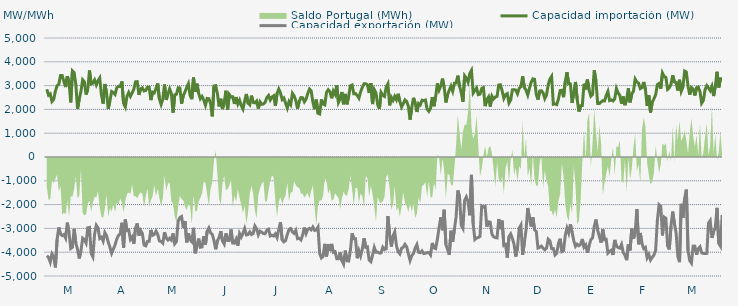
| Category | Capacidad importación (MW) | Capacidad exportación (MW) |
|---|---|---|
| 0 | 2845.5 | -4151.25 |
| 1900-01-01 | 2597.292 | -4215 |
| 1900-01-02 | 2650.375 | -4415.625 |
| 1900-01-03 | 2331.042 | -4066.875 |
| 1900-01-04 | 2415.625 | -4185 |
| 1900-01-05 | 2763.875 | -4638.75 |
| 1900-01-06 | 2996.042 | -3465 |
| 1900-01-07 | 3054.375 | -2960.625 |
| 1900-01-08 | 3421.875 | -3238.875 |
| 1900-01-09 | 3422.25 | -3301.458 |
| 1900-01-10 | 3168.75 | -3257.708 |
| 1900-01-11 | 2940.75 | -3407.5 |
| 1900-01-12 | 3391.875 | -2758.75 |
| 1900-01-13 | 3159.375 | -3175.208 |
| 1900-01-14 | 2294.792 | -3843.75 |
| 1900-01-15 | 3620.625 | -3793.125 |
| 1900-01-16 | 3550.208 | -3016.875 |
| 1900-01-17 | 3036.458 | -3616.875 |
| 1900-01-18 | 2023.333 | -3886.25 |
| 1900-01-19 | 2440.208 | -4263.75 |
| 1900-01-20 | 2764.167 | -3943.125 |
| 1900-01-21 | 3245.625 | -3410.667 |
| 1900-01-22 | 3161.25 | -3470.625 |
| 1900-01-23 | 2621.458 | -3614.625 |
| 1900-01-24 | 2861.25 | -2975.958 |
| 1900-01-25 | 3635.217 | -2962.391 |
| 1900-01-26 | 3071.083 | -4052.75 |
| 1900-01-27 | 3103.625 | -4196.25 |
| 1900-01-28 | 3238.125 | -3235.75 |
| 1900-01-29 | 3031.875 | -2868.708 |
| 1900-01-30 | 3202.5 | -2981.292 |
| 1900-01-31 | 3320.625 | -3422.292 |
| 1900-02-01 | 2615.625 | -3370.417 |
| 1900-02-02 | 2244.375 | -3535.625 |
| 1900-02-03 | 3067.5 | -3176.25 |
| 1900-02-04 | 2692.458 | -3306.875 |
| 1900-02-05 | 2025 | -3576.042 |
| 1900-02-06 | 2373.833 | -3795 |
| 1900-02-07 | 2750.458 | -4045 |
| 1900-02-08 | 2704.167 | -3868.417 |
| 1900-02-09 | 2628.75 | -3691.667 |
| 1900-02-10 | 2910 | -3448.125 |
| 1900-02-11 | 2971.875 | -3293.375 |
| 1900-02-12 | 2958.5 | -3229.167 |
| 1900-02-13 | 3174.375 | -2764.583 |
| 1900-02-14 | 2253.75 | -3813.75 |
| 1900-02-15 | 2100 | -2628.667 |
| 1900-02-16 | 2557.5 | -3088.333 |
| 1900-02-17 | 2713.125 | -3062.25 |
| 1900-02-18 | 2546.875 | -3463.625 |
| 1900-02-19 | 2686.458 | -3359.458 |
| 1900-02-20 | 2850 | -3646.042 |
| 1900-02-21 | 3159.375 | -2992.292 |
| 1900-02-22 | 3166.875 | -2793.125 |
| 1900-02-23 | 2613.75 | -3298.833 |
| 1900-02-24 | 2857.5 | -3089.625 |
| 1900-02-25 | 2903.875 | -3210.125 |
| 1900-02-26 | 2772 | -3696.792 |
| 1900-02-27 | 2797.5 | -3731.25 |
| 1900-02-28 | 2930.625 | -3545.625 |
| 1900-02-28 | 2932.5 | -3541.875 |
| 1900-03-01 | 2390.625 | -3064.167 |
| 1900-03-02 | 2726.25 | -3293.333 |
| 1900-03-03 | 2694.375 | -3252.708 |
| 1900-03-04 | 2878.125 | -3111.875 |
| 1900-03-05 | 3088.125 | -3247.5 |
| 1900-03-06 | 2435.625 | -3528.958 |
| 1900-03-07 | 2206.875 | -3547.708 |
| 1900-03-08 | 2435.625 | -3618.75 |
| 1900-03-09 | 3046.875 | -3157.917 |
| 1900-03-10 | 2400 | -3406.875 |
| 1900-03-11 | 2640 | -3488.125 |
| 1900-03-12 | 2866.875 | -3413.542 |
| 1900-03-13 | 2675.625 | -3486.458 |
| 1900-03-14 | 1861.25 | -3211.667 |
| 1900-03-15 | 2611.875 | -3644.375 |
| 1900-03-16 | 2638.125 | -3547.083 |
| 1900-03-17 | 2906.25 | -2688.333 |
| 1900-03-18 | 2904.375 | -2549.583 |
| 1900-03-19 | 2240.625 | -2502.083 |
| 1900-03-20 | 2576.25 | -2981.667 |
| 1900-03-21 | 2732.25 | -2689.375 |
| 1900-03-22 | 2919.375 | -3586.875 |
| 1900-03-23 | 3078.75 | -3206.25 |
| 1900-03-24 | 2587.5 | -3481.875 |
| 1900-03-25 | 2430 | -3560.625 |
| 1900-03-26 | 3341.25 | -2977.542 |
| 1900-03-27 | 2733.75 | -4046.25 |
| 1900-03-28 | 3080.625 | -3725.417 |
| 1900-03-29 | 2681.25 | -3429.375 |
| 1900-03-30 | 2448.75 | -3793.125 |
| 1900-03-31 | 2544.125 | -3778.125 |
| 1900-04-01 | 2394.958 | -3328.125 |
| 1900-04-02 | 2175 | -3678.75 |
| 1900-04-03 | 2461.167 | -3117.375 |
| 1900-04-04 | 2448.75 | -2981.542 |
| 1900-04-05 | 2255.042 | -3185.833 |
| 1900-04-06 | 1708.042 | -3250.208 |
| 1900-04-07 | 2981.25 | -3508.125 |
| 1900-04-08 | 2998.125 | -3877.5 |
| 1900-04-09 | 2664.375 | -3519.375 |
| 1900-04-10 | 2124.375 | -3382.5 |
| 1900-04-11 | 2446.875 | -3115.792 |
| 1900-04-12 | 2015.417 | -3534.375 |
| 1900-04-13 | 2289.375 | -3658.125 |
| 1900-04-14 | 2784.375 | -3211.083 |
| 1900-04-15 | 1993.125 | -3504.792 |
| 1900-04-16 | 2624.875 | -3506.458 |
| 1900-04-17 | 2523.75 | -3042.583 |
| 1900-04-18 | 2531.25 | -3613.125 |
| 1900-04-19 | 2229.583 | -3620.625 |
| 1900-04-20 | 2515.875 | -3455.625 |
| 1900-04-21 | 2227.5 | -3723.75 |
| 1900-04-22 | 2388.375 | -3217.458 |
| 1900-04-23 | 2157.875 | -3361.542 |
| 1900-04-24 | 2014.583 | -3202.708 |
| 1900-04-25 | 2357.917 | -3006.583 |
| 1900-04-26 | 2647.75 | -3275.625 |
| 1900-04-27 | 2259.375 | -3258.75 |
| 1900-04-28 | 2191.875 | -3148.125 |
| 1900-04-29 | 2578.125 | -3256.875 |
| 1900-04-30 | 2289.375 | -3211.875 |
| 1900-05-01 | 2272.917 | -2898.25 |
| 1900-05-02 | 2349.75 | -3012.25 |
| 1900-05-03 | 2034.167 | -3270 |
| 1900-05-04 | 2319.375 | -3116.25 |
| 1900-05-05 | 2214.375 | -3159.375 |
| 1900-05-06 | 2229.167 | -3217.5 |
| 1900-05-07 | 2296.875 | -3223.125 |
| 1900-05-08 | 2497.5 | -3080.208 |
| 1900-05-09 | 2585.5 | -3034.292 |
| 1900-05-10 | 2394.375 | -3318.75 |
| 1900-05-11 | 2520 | -3286.875 |
| 1900-05-12 | 2570.625 | -3320.625 |
| 1900-05-13 | 2145 | -3229.583 |
| 1900-05-14 | 2673.75 | -3384.375 |
| 1900-05-15 | 2855.625 | -3040.333 |
| 1900-05-16 | 2689.875 | -2741.708 |
| 1900-05-17 | 2413.125 | -3485.625 |
| 1900-05-18 | 2476.875 | -3564.375 |
| 1900-05-19 | 2258.75 | -3510 |
| 1900-05-20 | 2056.875 | -3258.75 |
| 1900-05-21 | 2326.875 | -3036.667 |
| 1900-05-22 | 2203.125 | -3003.75 |
| 1900-05-23 | 2675.333 | -3153.417 |
| 1900-05-24 | 2572.5 | -3211.875 |
| 1900-05-25 | 2368.125 | -3082.917 |
| 1900-05-26 | 2032.5 | -3433.125 |
| 1900-05-27 | 2340 | -3418.125 |
| 1900-05-28 | 2499.375 | -3485.625 |
| 1900-05-29 | 2488.125 | -3277.5 |
| 1900-05-30 | 2317.5 | -2963.167 |
| 1900-05-31 | 2431.875 | -3217.5 |
| 1900-06-01 | 2668.125 | -3039.375 |
| 1900-06-02 | 2855.625 | -2998.125 |
| 1900-06-03 | 2778.75 | -3061.667 |
| 1900-06-04 | 2311.875 | -2941.042 |
| 1900-06-05 | 2010 | -3084.375 |
| 1900-06-06 | 2411.25 | -3065.625 |
| 1900-06-07 | 1837.917 | -2945.625 |
| 1900-06-08 | 1809.167 | -4055.625 |
| 1900-06-09 | 2419.792 | -4241.25 |
| 1900-06-10 | 2227.5 | -4173.75 |
| 1900-06-11 | 2191.875 | -3648.75 |
| 1900-06-12 | 2715 | -4183.125 |
| 1900-06-13 | 2826.625 | -3667.292 |
| 1900-06-14 | 2745 | -3950.625 |
| 1900-06-15 | 2467.5 | -3652.625 |
| 1900-06-16 | 2771.25 | -4006.875 |
| 1900-06-17 | 2640 | -3980.625 |
| 1900-06-18 | 3016.875 | -4271.25 |
| 1900-06-19 | 2292.292 | -4271.25 |
| 1900-06-20 | 2448.75 | -4010.625 |
| 1900-06-21 | 2730 | -4357.5 |
| 1900-06-22 | 2214.75 | -4501.875 |
| 1900-06-23 | 2650.208 | -3931.667 |
| 1900-06-24 | 2212.5 | -4361.25 |
| 1900-06-25 | 2565 | -4370.625 |
| 1900-06-26 | 2988.75 | -3920.625 |
| 1900-06-27 | 3024.375 | -3204.083 |
| 1900-06-28 | 2656.875 | -3437.708 |
| 1900-06-29 | 2664.375 | -3437.5 |
| 1900-06-30 | 2587.5 | -4254.375 |
| 1900-07-01 | 2473.125 | -3939.583 |
| 1900-07-02 | 2737.5 | -4156.875 |
| 1900-07-03 | 2932.5 | -3862.5 |
| 1900-07-04 | 3080.625 | -3412.708 |
| 1900-07-05 | 3078.125 | -3793.125 |
| 1900-07-06 | 3031.25 | -3776.25 |
| 1900-07-07 | 2689.875 | -4331.25 |
| 1900-07-08 | 3104.042 | -4396.875 |
| 1900-07-09 | 2223.25 | -4126.875 |
| 1900-07-10 | 2830.208 | -3799.583 |
| 1900-07-11 | 2694.375 | -3999.792 |
| 1900-07-12 | 2193.542 | -3994.167 |
| 1900-07-13 | 2019.375 | -4039.792 |
| 1900-07-14 | 2710.792 | -4026.667 |
| 1900-07-15 | 2589.292 | -3790.625 |
| 1900-07-16 | 2542.5 | -3888.75 |
| 1900-07-17 | 2943.75 | -3856.875 |
| 1900-07-18 | 3076.875 | -2486 |
| 1900-07-19 | 2169.583 | -3271.875 |
| 1900-07-20 | 2510.875 | -3762.292 |
| 1900-07-21 | 2379.375 | -3315.625 |
| 1900-07-22 | 2548.125 | -3149.875 |
| 1900-07-23 | 2405.625 | -3725.625 |
| 1900-07-24 | 2655.792 | -3978.75 |
| 1900-07-25 | 2338.917 | -4070.625 |
| 1900-07-26 | 2100.75 | -3836.25 |
| 1900-07-27 | 2239.583 | -3791.25 |
| 1900-07-28 | 2398.417 | -3671.25 |
| 1900-07-29 | 2333.375 | -3772.5 |
| 1900-07-30 | 2128.125 | -4065 |
| 1900-07-31 | 1568.375 | -4348.125 |
| 1900-08-01 | 2080.083 | -4146.125 |
| 1900-08-02 | 2486.208 | -4052.083 |
| 1900-08-03 | 2275.5 | -3824.583 |
| 1900-08-04 | 1891.708 | -3681.25 |
| 1900-08-05 | 2248.292 | -4001.25 |
| 1900-08-06 | 2190.75 | -4023.75 |
| 1900-08-07 | 2386.583 | -3945 |
| 1900-08-08 | 2366.708 | -4057.5 |
| 1900-08-09 | 2393.375 | -4042.25 |
| 1900-08-10 | 2007.375 | -4017.708 |
| 1900-08-11 | 1918.833 | -4016.25 |
| 1900-08-12 | 2042.417 | -4115.625 |
| 1900-08-13 | 2516.25 | -3611.25 |
| 1900-08-14 | 2132.708 | -3815.625 |
| 1900-08-15 | 2530.208 | -3849.375 |
| 1900-08-16 | 3090 | -3459.375 |
| 1900-08-17 | 2808.75 | -2974.875 |
| 1900-08-18 | 2978.125 | -2539.125 |
| 1900-08-19 | 3292.5 | -3075.208 |
| 1900-08-20 | 2935 | -2217.083 |
| 1900-08-21 | 2289.583 | -3673.125 |
| 1900-08-22 | 2619.375 | -3890.625 |
| 1900-08-23 | 2814.792 | -4110 |
| 1900-08-24 | 2979.375 | -3099.375 |
| 1900-08-25 | 2767.5 | -3556.875 |
| 1900-08-26 | 3099.375 | -3031.875 |
| 1900-08-27 | 3111.25 | -2508.75 |
| 1900-08-28 | 3418.125 | -1406.875 |
| 1900-08-29 | 2979.6 | -1681.6 |
| 1900-08-30 | 2705.333 | -2868.75 |
| 1900-08-31 | 2324.458 | -2999 |
| 1900-09-01 | 3414.375 | -1815.417 |
| 1900-09-02 | 3313.125 | -1677.917 |
| 1900-09-03 | 3144.583 | -1882.667 |
| 1900-09-04 | 3511.875 | -2448.75 |
| 1900-09-05 | 3639.375 | -750.708 |
| 1900-09-06 | 2688.958 | -2820 |
| 1900-09-07 | 2797.542 | -3465 |
| 1900-09-08 | 2902.5 | -3399.375 |
| 1900-09-09 | 2618.042 | -3382.5 |
| 1900-09-10 | 2643.417 | -3336.125 |
| 1900-09-11 | 2878.125 | -2058.75 |
| 1900-09-12 | 2915 | -2101.875 |
| 1900-09-13 | 2137.708 | -2068.125 |
| 1900-09-14 | 2411.042 | -2928.75 |
| 1900-09-15 | 2524.375 | -2722.5 |
| 1900-09-16 | 2118.542 | -2739.375 |
| 1900-09-17 | 2559.458 | -3244.292 |
| 1900-09-18 | 2440.833 | -3354.75 |
| 1900-09-19 | 2521.167 | -3387.25 |
| 1900-09-20 | 2546.333 | -3396.375 |
| 1900-09-21 | 3028.125 | -2606.25 |
| 1900-09-22 | 3031.875 | -3030 |
| 1900-09-23 | 2773.917 | -2675.625 |
| 1900-09-24 | 2465.417 | -3720 |
| 1900-09-25 | 2620.708 | -3684.375 |
| 1900-09-26 | 2665.625 | -4224.375 |
| 1900-09-27 | 2266.875 | -3343.125 |
| 1900-09-28 | 2395.625 | -3230.625 |
| 1900-09-29 | 2820.417 | -3421.875 |
| 1900-09-30 | 2831.667 | -3678.75 |
| 1900-10-01 | 2807.708 | -4181.25 |
| 1900-10-02 | 2656.917 | -3808.125 |
| 1900-10-03 | 2889.375 | -2983.125 |
| 1900-10-04 | 2955.417 | -2856.75 |
| 1900-10-05 | 3390.125 | -4111.875 |
| 1900-10-06 | 2918.167 | -3607.5 |
| 1900-10-07 | 2805 | -3067.5 |
| 1900-10-08 | 2603.792 | -2143.125 |
| 1900-10-09 | 2889.792 | -2566.125 |
| 1900-10-10 | 3138.75 | -2918.333 |
| 1900-10-11 | 3284.583 | -2531.167 |
| 1900-10-12 | 3266.875 | -3054.375 |
| 1900-10-13 | 2630.625 | -3127.125 |
| 1900-10-14 | 2410.625 | -3825 |
| 1900-10-15 | 2771.375 | -3800.625 |
| 1900-10-16 | 2785.375 | -3746.25 |
| 1900-10-17 | 2693.917 | -3833.125 |
| 1900-10-18 | 2453.958 | -3898.125 |
| 1900-10-19 | 2603.042 | -3832.458 |
| 1900-10-20 | 3040.208 | -3455.125 |
| 1900-10-21 | 3274.75 | -3527.125 |
| 1900-10-22 | 3387 | -3843.75 |
| 1900-10-23 | 2216.667 | -3847.5 |
| 1900-10-24 | 2229.75 | -4117.5 |
| 1900-10-25 | 2201.625 | -4044.375 |
| 1900-10-26 | 2438.958 | -3630 |
| 1900-10-27 | 2792.375 | -3435 |
| 1900-10-28 | 2803.958 | -3975 |
| 1900-10-29 | 2513.542 | -3933.75 |
| 1900-10-30 | 3165 | -3294.375 |
| 1900-10-31 | 3560.625 | -2987.875 |
| 1900-11-01 | 3075.25 | -3193.125 |
| 1900-11-02 | 3073.417 | -2827.208 |
| 1900-11-03 | 2270.625 | -3162.75 |
| 1900-11-04 | 2727.5 | -3519.375 |
| 1900-11-05 | 3154.417 | -3755.625 |
| 1900-11-06 | 2418.792 | -3661.875 |
| 1900-11-07 | 1908.75 | -3729.375 |
| 1900-11-08 | 2155 | -3669.625 |
| 1900-11-09 | 2159.708 | -3444.375 |
| 1900-11-10 | 3076.458 | -3791.25 |
| 1900-11-11 | 2842.292 | -3698.125 |
| 1900-11-12 | 3253.542 | -4020 |
| 1900-11-13 | 2809.042 | -3716.25 |
| 1900-11-14 | 2558.833 | -3474.375 |
| 1900-11-15 | 2631.875 | -3401.25 |
| 1900-11-16 | 3639.375 | -2911.875 |
| 1900-11-17 | 3192.292 | -2627.375 |
| 1900-11-18 | 2248.167 | -3073.125 |
| 1900-11-19 | 2244.375 | -3343.125 |
| 1900-11-20 | 2309.583 | -3596.625 |
| 1900-11-21 | 2366.167 | -3043.125 |
| 1900-11-22 | 2354.167 | -3474.375 |
| 1900-11-23 | 2578.958 | -3457.5 |
| 1900-11-24 | 2753.5 | -4040.625 |
| 1900-11-25 | 2372.208 | -3969.375 |
| 1900-11-26 | 2398.458 | -3918.75 |
| 1900-11-27 | 2354.167 | -4115.625 |
| 1900-11-28 | 2437.625 | -3484.625 |
| 1900-11-29 | 2874.167 | -3740.625 |
| 1900-11-30 | 2690.583 | -3803.75 |
| 1900-12-01 | 2590.875 | -3828.75 |
| 1900-12-02 | 2241.875 | -3671.25 |
| 1900-12-03 | 2542.292 | -4008.75 |
| 1900-12-04 | 2178.333 | -4123.125 |
| 1900-12-05 | 2426.208 | -4335 |
| 1900-12-06 | 2888.333 | -3675 |
| 1900-12-07 | 2294.25 | -3925 |
| 1900-12-08 | 2647.5 | -3010.625 |
| 1900-12-09 | 2762.083 | -3433.917 |
| 1900-12-10 | 3275.625 | -3162.875 |
| 1900-12-11 | 3155.625 | -2184.667 |
| 1900-12-12 | 3101.25 | -3667.5 |
| 1900-12-13 | 2874.417 | -3191.25 |
| 1900-12-14 | 2917.708 | -3645 |
| 1900-12-15 | 3152.792 | -3847.5 |
| 1900-12-16 | 2842.417 | -3796.875 |
| 1900-12-17 | 2144.167 | -4231.875 |
| 1900-12-18 | 2593.958 | -4093.125 |
| 1900-12-19 | 1870.625 | -4327.5 |
| 1900-12-20 | 2301.042 | -4213.125 |
| 1900-12-21 | 2442.042 | -4120.875 |
| 1900-12-22 | 2615.292 | -3922.5 |
| 1900-12-23 | 3039.375 | -2676.125 |
| 1900-12-24 | 3086.25 | -2005.625 |
| 1900-12-25 | 2871.042 | -2072.667 |
| 1900-12-26 | 3528.75 | -3293.5 |
| 1900-12-27 | 3386.25 | -2523.75 |
| 1900-12-28 | 3343.75 | -2572.708 |
| 1900-12-29 | 2842.25 | -3728.75 |
| 1900-12-30 | 2908.125 | -3885 |
| 1900-12-31 | 3053.458 | -2893.125 |
| 1901-01-01 | 3434.792 | -2293.333 |
| 1901-01-02 | 3154.708 | -2801.958 |
| 1901-01-03 | 3127.292 | -3183.75 |
| 1901-01-04 | 2791.958 | -4171.875 |
| 1901-01-05 | 3245.583 | -4417.5 |
| 1901-01-06 | 2756.125 | -1968.958 |
| 1901-01-07 | 2935 | -2553.75 |
| 1901-01-08 | 3611.25 | -1738.958 |
| 1901-01-09 | 3570 | -1370.167 |
| 1901-01-10 | 2968.958 | -3944 |
| 1901-01-11 | 2617.708 | -4351.875 |
| 1901-01-12 | 2914.583 | -4456.875 |
| 1901-01-13 | 2854.125 | -3740.625 |
| 1901-01-14 | 2583.75 | -3744.375 |
| 1901-01-15 | 2909.208 | -4106.25 |
| 1901-01-16 | 2942.333 | -3853.125 |
| 1901-01-17 | 2743.5 | -3772.5 |
| 1901-01-18 | 2260.208 | -4027.5 |
| 1901-01-19 | 2376.25 | -4050 |
| 1901-01-20 | 2831.25 | -4057.5 |
| 1901-01-21 | 2996.958 | -4050 |
| 1901-01-22 | 2902.5 | -2776.875 |
| 1901-01-23 | 2788.125 | -2668.792 |
| 1901-01-24 | 2970 | -3396.75 |
| 1901-01-25 | 2561.25 | -3137.083 |
| 1901-01-26 | 2979.917 | -2953.042 |
| 1901-01-27 | 3581.25 | -2136.583 |
| 1901-01-28 | 2918.958 | -3628.125 |
| 1901-01-29 | 3287.708 | -3748.125 |
| 1901-01-30 | 3286.826 | -2437.652 |